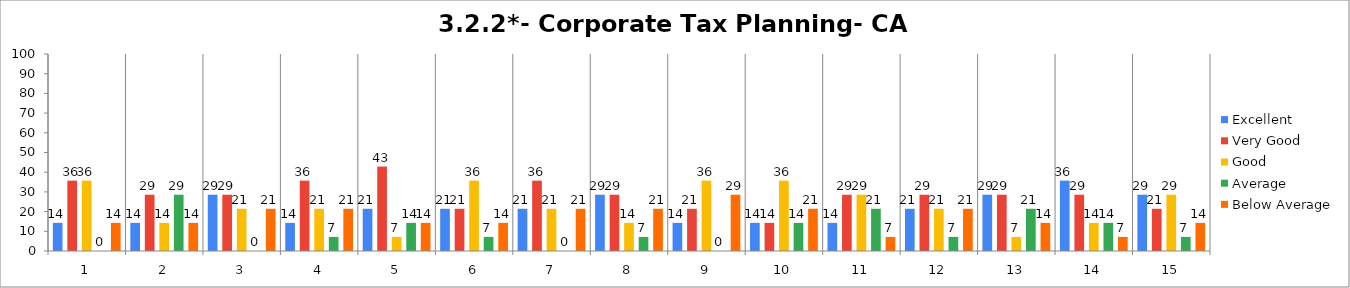
| Category | Excellent | Very Good | Good | Average | Below Average |
|---|---|---|---|---|---|
| 0 | 14.286 | 35.714 | 35.714 | 0 | 14.286 |
| 1 | 14.286 | 28.571 | 14.286 | 28.571 | 14.286 |
| 2 | 28.571 | 28.571 | 21.429 | 0 | 21.429 |
| 3 | 14.286 | 35.714 | 21.429 | 7.143 | 21.429 |
| 4 | 21.429 | 42.857 | 7.143 | 14.286 | 14.286 |
| 5 | 21.429 | 21.429 | 35.714 | 7.143 | 14.286 |
| 6 | 21.429 | 35.714 | 21.429 | 0 | 21.429 |
| 7 | 28.571 | 28.571 | 14.286 | 7.143 | 21.429 |
| 8 | 14.286 | 21.429 | 35.714 | 0 | 28.571 |
| 9 | 14.286 | 14.286 | 35.714 | 14.286 | 21.429 |
| 10 | 14.286 | 28.571 | 28.571 | 21.429 | 7.143 |
| 11 | 21.429 | 28.571 | 21.429 | 7.143 | 21.429 |
| 12 | 28.571 | 28.571 | 7.143 | 21.429 | 14.286 |
| 13 | 35.714 | 28.571 | 14.286 | 14.286 | 7.143 |
| 14 | 28.571 | 21.429 | 28.571 | 7.143 | 14.286 |